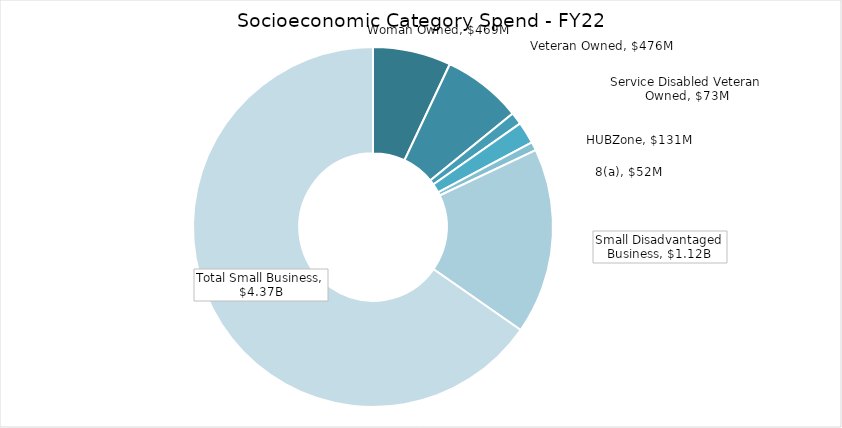
| Category | Series 0 |
|---|---|
| Woman Owned | 468923653 |
| Veteran Owned | 476440088 |
| Service Disabled Veteran Owned | 73438141 |
| HUBZone | 131438903 |
| 8(a) | 51770424 |
| Small Disadvantaged Business | 1116880037 |
| Total Small Business | 4365277562 |